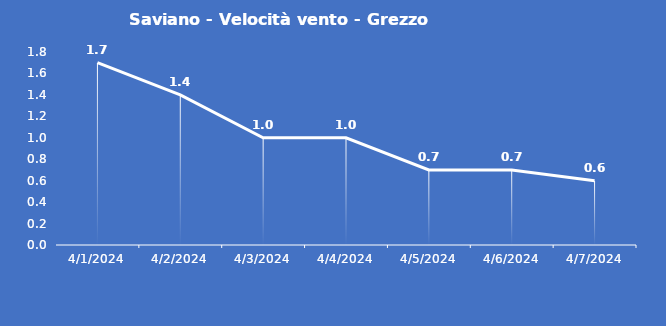
| Category | Saviano - Velocità vento - Grezzo (m/s) |
|---|---|
| 4/1/24 | 1.7 |
| 4/2/24 | 1.4 |
| 4/3/24 | 1 |
| 4/4/24 | 1 |
| 4/5/24 | 0.7 |
| 4/6/24 | 0.7 |
| 4/7/24 | 0.6 |